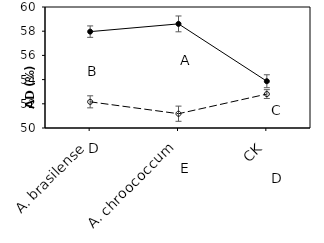
| Category | Bt | Xy |
|---|---|---|
|    A. brasilense | 57.964 | 52.163 |
|    A. chroococcum | 58.604 | 51.181 |
| CK | 53.865 | 52.804 |